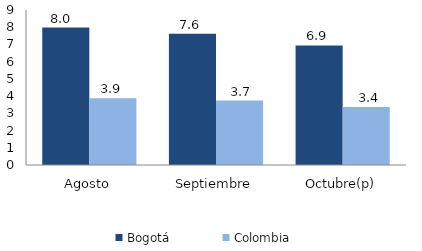
| Category | Bogotá | Colombia |
|---|---|---|
| Agosto | 7.981 | 3.878 |
| Septiembre | 7.624 | 3.745 |
| Octubre(p) | 6.94 | 3.368 |